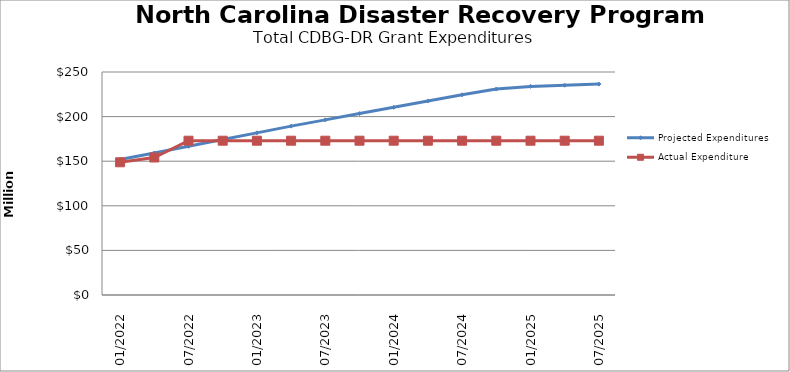
| Category | Projected Expenditures | Actual Expenditure |
|---|---|---|
| 01/2022 | 151875408.985 | 148800802.35 |
| 4/2022 | 159159477.985 | 154171389.97 |
| 07/2022 | 166693546.985 | 172971963.87 |
| 10/2022 | 174227615.985 | 172971963.87 |
| 01/2023 | 181761684.985 | 172971963.87 |
| 4/2023 | 189295753.985 | 172971963.87 |
| 07/2023 | 196329824.985 | 172971963.87 |
| 10/2023 | 203363895.985 | 172971963.87 |
| 01/2024 | 210417966.985 | 172971963.87 |
| 4/2024 | 217472037.985 | 172971963.87 |
| 07/2024 | 224416123.985 | 172971963.87 |
| 10/2024 | 230870194.985 | 172971963.87 |
| 01/2025 | 233870194.985 | 172971963.87 |
| 4/2025 | 235165112.985 | 172971963.87 |
| 07/2025 | 236422222.985 | 172971963.87 |